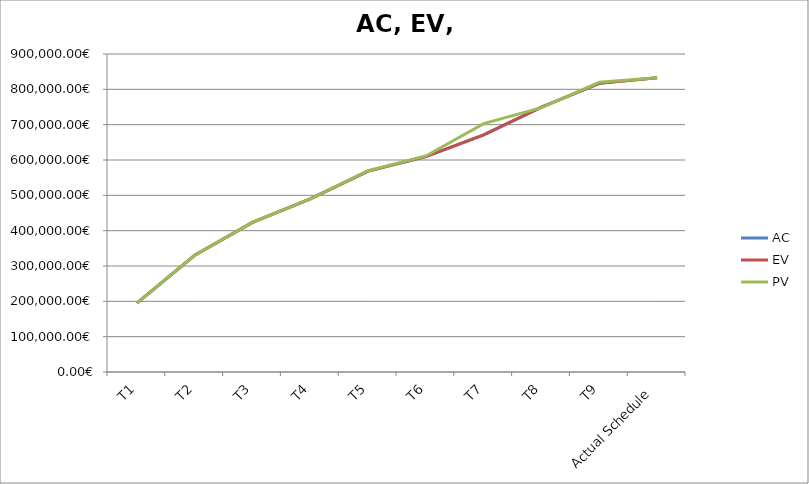
| Category | AC | EV | PV |
|---|---|---|---|
| T1 | 194758.989 | 194758.989 | 194758.989 |
| T2 | 330315.308 | 330315.308 | 330315.308 |
| T3 | 423263.839 | 423263.839 | 423263.839 |
| T4 | 489933.38 | 489933.38 | 489933.38 |
| T5 | 568700.708 | 568700.708 | 569740.708 |
| T6 | 609724.217 | 609724.218 | 611484.217 |
| T7 | 670958.388 | 670958.388 | 702854.708 |
| T8 | 749355.109 | 749355.11 | 748275.109 |
| T9 | 816897.46 | 816897.46 | 820017.46 |
| Actual Schedule | 832497.46 | 832497.46 | 832497.46 |